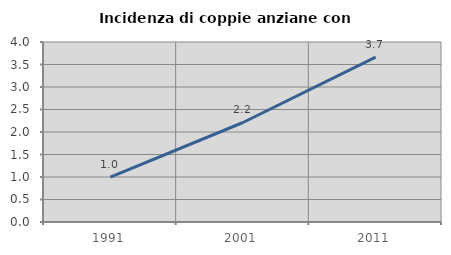
| Category | Incidenza di coppie anziane con figli |
|---|---|
| 1991.0 | 0.997 |
| 2001.0 | 2.211 |
| 2011.0 | 3.662 |